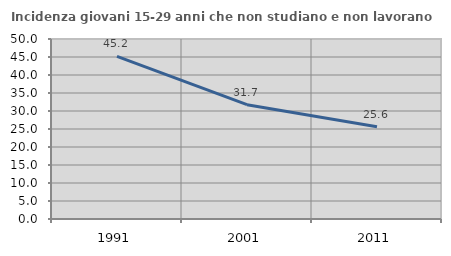
| Category | Incidenza giovani 15-29 anni che non studiano e non lavorano  |
|---|---|
| 1991.0 | 45.188 |
| 2001.0 | 31.746 |
| 2011.0 | 25.632 |